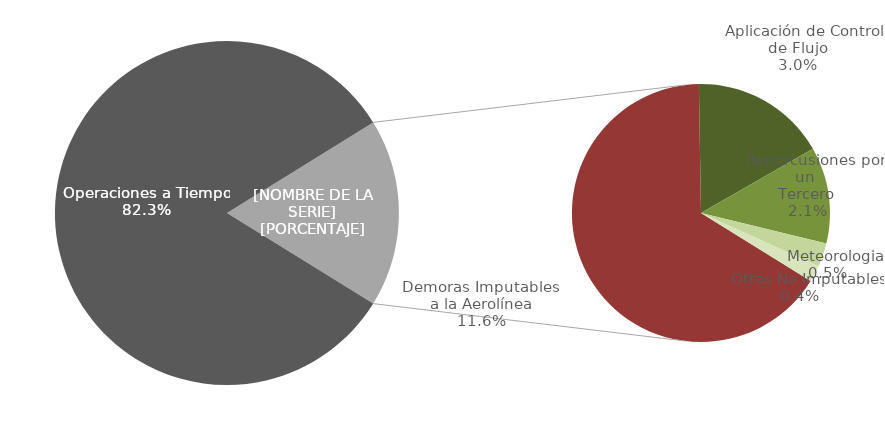
| Category | Demoras |
|---|---|
| Operaciones a Tiempo | 6126 |
| Demoras Imputables 
a la Aerolínea | 866 |
|    Aplicación de Control 
de Flujo | 223 |
|    Repercusiones por un 
Tercero | 159 |
|    Meteorologia | 39 |
|    Otras No Imputables | 27 |